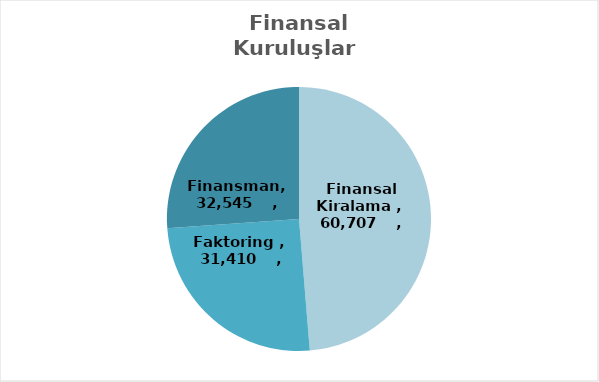
| Category | Series 0 |
|---|---|
| Finansal Kiralama  | 60707 |
| Faktoring  | 31410 |
| Finansman | 32545 |